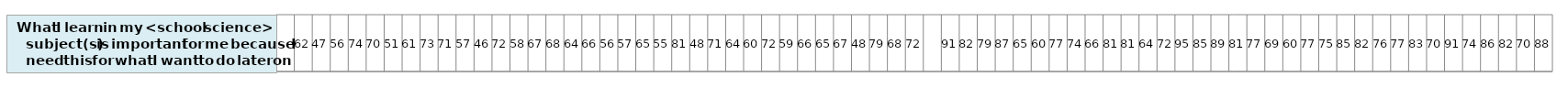
| Category | What I learn in my <school science> subject(s) is important for me because I need this for what I want to do later on |
|---|---|
| nan | 1 |
| 61.59356235156442 | 1 |
| 47.21221414417144 | 1 |
| 55.71793581959364 | 1 |
| 73.59689000216221 | 1 |
| 70.12554851683356 | 1 |
| 51.41910333181555 | 1 |
| 60.53510042031486 | 1 |
| 73.41387641974376 | 1 |
| 70.68603885304479 | 1 |
| 56.7884589254413 | 1 |
| 45.66181363381516 | 1 |
| 72.45724761165462 | 1 |
| 57.53725679442605 | 1 |
| 67.2608144293344 | 1 |
| 67.80926674749392 | 1 |
| 63.56814869382631 | 1 |
| 65.66337335286306 | 1 |
| 56.43340783144596 | 1 |
| 56.92704405864762 | 1 |
| 65.28205060067197 | 1 |
| 54.74000929823448 | 1 |
| 81.04129719506625 | 1 |
| 47.97676145306036 | 1 |
| 71.1955975827377 | 1 |
| 64.2820446767333 | 1 |
| 60.28060302131203 | 1 |
| 72.11665665202167 | 1 |
| 59.29696715781696 | 1 |
| 66.24885366528152 | 1 |
| 65.40027519521516 | 1 |
| 67.36191278817064 | 1 |
| 47.82134985679345 | 1 |
| 79.02592976532561 | 1 |
| 67.55604150393918 | 1 |
| 72.20891148954126 | 1 |
| nan | 1 |
| 90.99155576814255 | 1 |
| 81.51893978487072 | 1 |
| 78.88716907122227 | 1 |
| 86.76299015925215 | 1 |
| 64.99958529312266 | 1 |
| 59.73327515868125 | 1 |
| 77.39797541567836 | 1 |
| 74.02303286842886 | 1 |
| 66.30821647470762 | 1 |
| 80.55054699991477 | 1 |
| 81.05083198344164 | 1 |
| 63.77541342321295 | 1 |
| 71.85122021410658 | 1 |
| 94.63083381187462 | 1 |
| 85.36752655461518 | 1 |
| 89.24018816411622 | 1 |
| 81.48641074349081 | 1 |
| 77.02726230220462 | 1 |
| 68.87532065940188 | 1 |
| 60.11674374427436 | 1 |
| 77.30449874898362 | 1 |
| 75.29608078842408 | 1 |
| 85.43861150609715 | 1 |
| 81.80982678383151 | 1 |
| 75.50094594755129 | 1 |
| 76.52394820460991 | 1 |
| 83.24663774955505 | 1 |
| 70.09879380200971 | 1 |
| 91.11077895521437 | 1 |
| 74.05370043343657 | 1 |
| 85.99462053456936 | 1 |
| 81.77210014733271 | 1 |
| 70.47940647201104 | 1 |
| 87.94817899679327 | 1 |